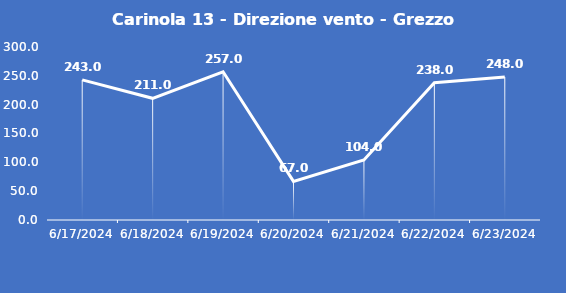
| Category | Carinola 13 - Direzione vento - Grezzo (°N) |
|---|---|
| 6/17/24 | 243 |
| 6/18/24 | 211 |
| 6/19/24 | 257 |
| 6/20/24 | 67 |
| 6/21/24 | 104 |
| 6/22/24 | 238 |
| 6/23/24 | 248 |